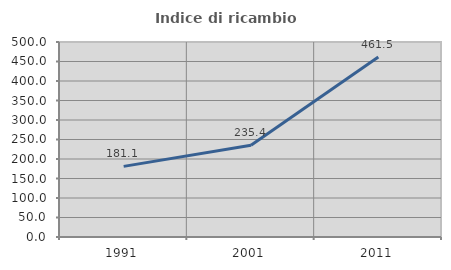
| Category | Indice di ricambio occupazionale  |
|---|---|
| 1991.0 | 181.081 |
| 2001.0 | 235.417 |
| 2011.0 | 461.538 |